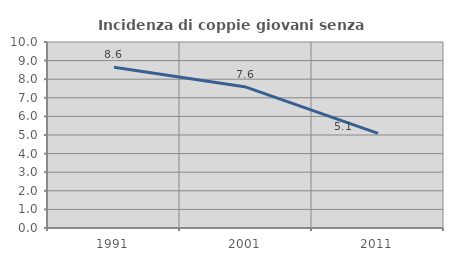
| Category | Incidenza di coppie giovani senza figli |
|---|---|
| 1991.0 | 8.642 |
| 2001.0 | 7.576 |
| 2011.0 | 5.085 |